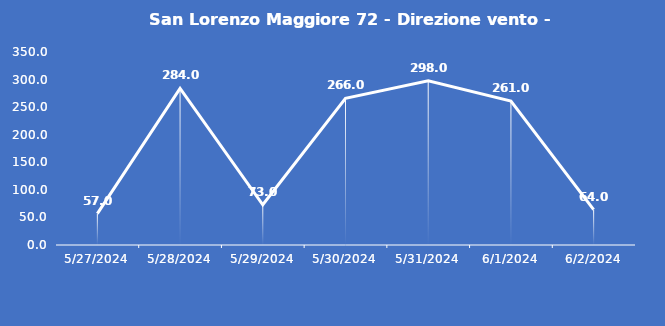
| Category | San Lorenzo Maggiore 72 - Direzione vento - Grezzo (°N) |
|---|---|
| 5/27/24 | 57 |
| 5/28/24 | 284 |
| 5/29/24 | 73 |
| 5/30/24 | 266 |
| 5/31/24 | 298 |
| 6/1/24 | 261 |
| 6/2/24 | 64 |